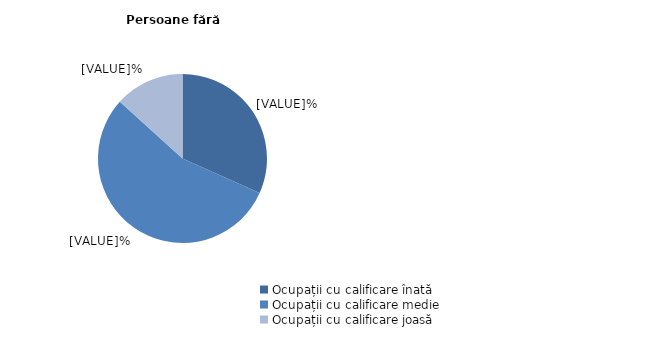
| Category | Persoane fără dizabilități |
|---|---|
| Ocupații cu calificare înată | 31.7 |
| Ocupații cu calificare medie | 55 |
| Ocupații cu calificare joasă | 13.3 |